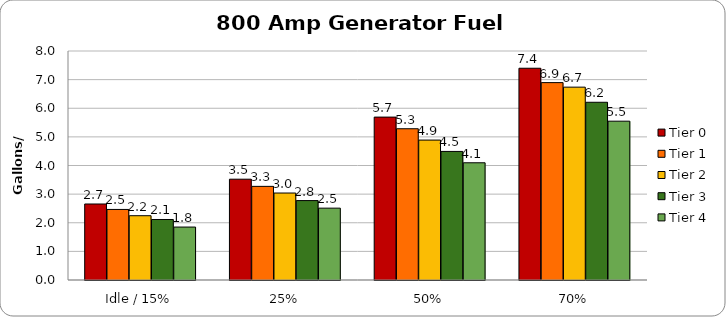
| Category | Tier 0 | Tier 1 | Tier 2 | Tier 3 | Tier 4 |
|---|---|---|---|---|---|
| Idle / 15% | 2.655 | 2.465 | 2.246 | 2.114 | 1.849 |
| 25% | 3.522 | 3.271 | 3.038 | 2.774 | 2.51 |
| 50% | 5.691 | 5.284 | 4.888 | 4.491 | 4.095 |
| 70% | 7.398 | 6.896 | 6.737 | 6.209 | 5.548 |